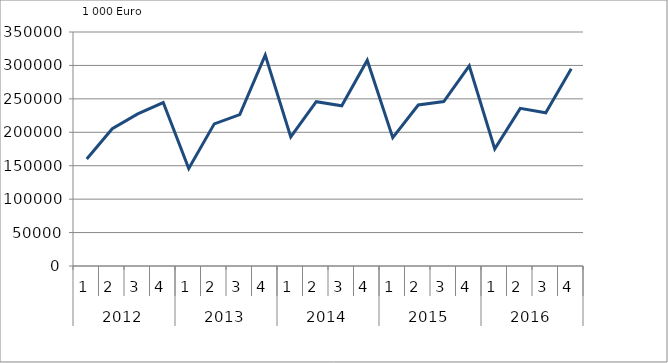
| Category | Ausbaugewerblicher Umsatz3 |
|---|---|
| 0 | 160065 |
| 1 | 205323 |
| 2 | 227469 |
| 3 | 244537 |
| 4 | 145792.596 |
| 5 | 212577 |
| 6 | 226327.748 |
| 7 | 315433.896 |
| 8 | 193004.858 |
| 9 | 245754.159 |
| 10 | 239547.85 |
| 11 | 307688.935 |
| 12 | 192043.756 |
| 13 | 240826.879 |
| 14 | 245916.087 |
| 15 | 299455.378 |
| 16 | 175225.59 |
| 17 | 235781.631 |
| 18 | 229227.559 |
| 19 | 294992.157 |